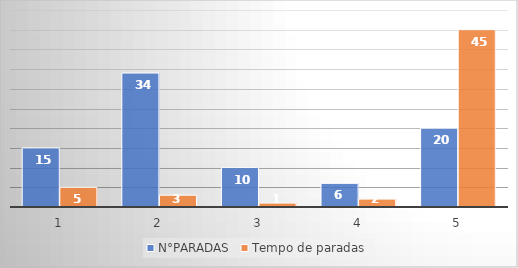
| Category | N°PARADAS | Tempo de paradas |
|---|---|---|
| 0 | 15 | 5 |
| 1 | 34 | 3 |
| 2 | 10 | 1 |
| 3 | 6 | 2 |
| 4 | 20 | 45 |